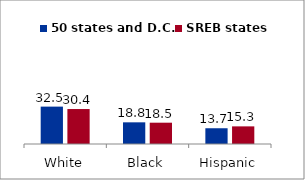
| Category | 50 states and D.C. | SREB states |
|---|---|---|
| White | 32.505 | 30.41 |
| Black | 18.846 | 18.527 |
| Hispanic | 13.699 | 15.327 |